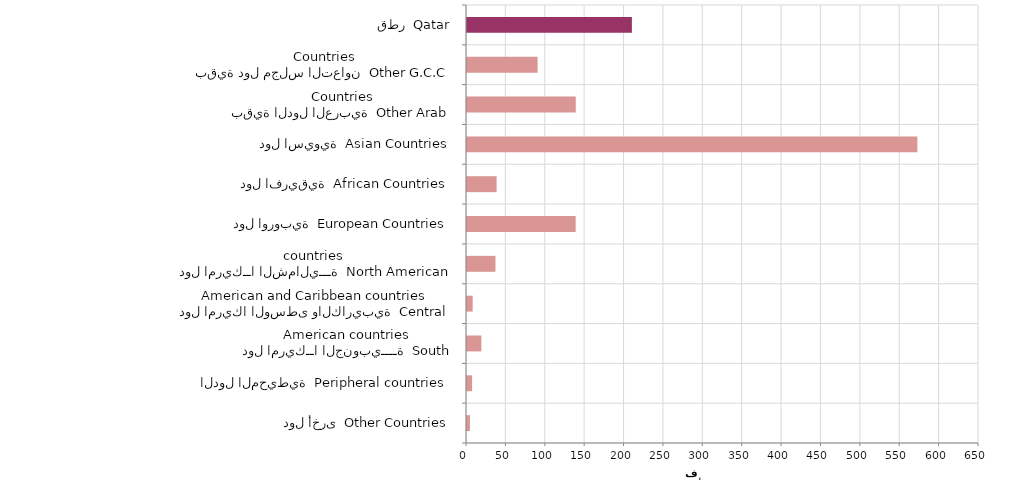
| Category | Series 0 |
|---|---|
| دول أخرى  Other Countries | 3719 |
| الدول المحيطية  Peripheral countries | 6459 |
| دول امريكــا الجنوبيــــة  South American countries | 18246 |
| دول امريكا الوسطى والكاريبية  Central American and Caribbean countries | 7209 |
| دول امريكــا الشماليـــة  North American countries  | 36138 |
| دول اوروبية  European Countries | 137950 |
| دول افريقية  African Countries | 37572 |
| دول اسيوية  Asian Countries | 571779 |
| بقية الدول العربية  Other Arab Countries | 138074 |
| بقية دول مجلس التعاون  Other G.C.C Countries | 89617 |
| قطر  Qatar | 209324 |